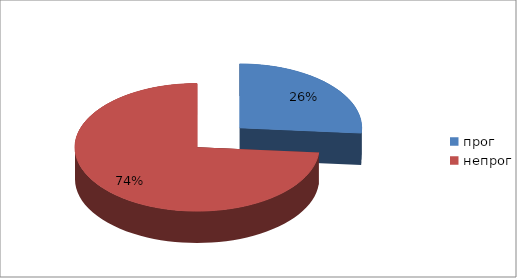
| Category | Series 0 |
|---|---|
| прог | 35 |
| непрог | 98 |